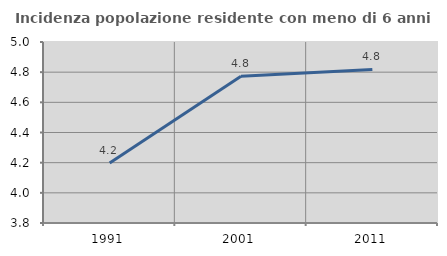
| Category | Incidenza popolazione residente con meno di 6 anni |
|---|---|
| 1991.0 | 4.197 |
| 2001.0 | 4.773 |
| 2011.0 | 4.818 |